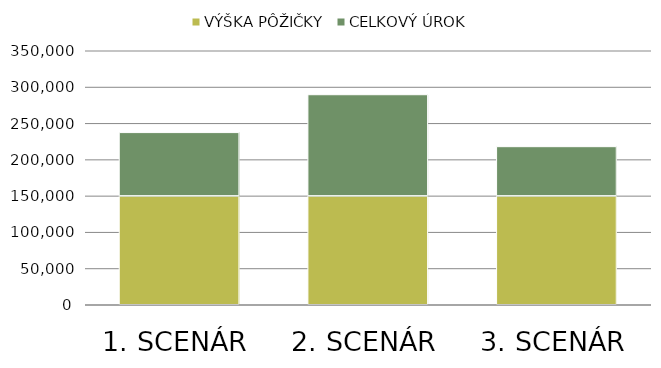
| Category | VÝŠKA PÔŽIČKY | CELKOVÝ ÚROK |
|---|---|---|
| 1. SCENÁR | 150000 | 87584.066 |
| 2. SCENÁR | 150000 | 139753.762 |
| 3. SCENÁR | 150000 | 68152.919 |